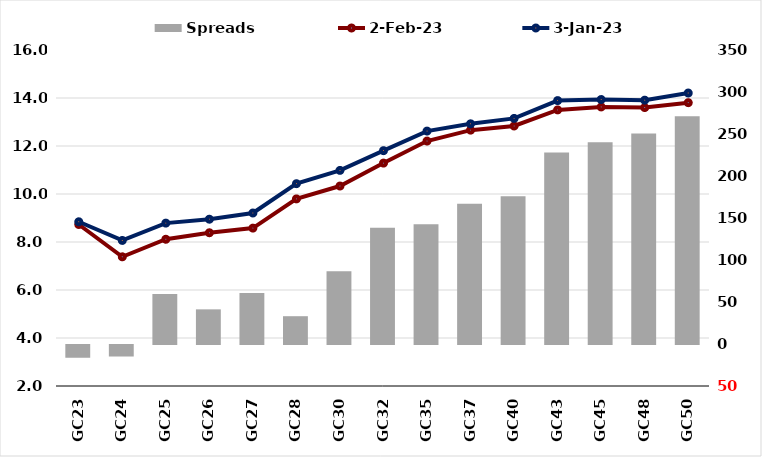
| Category |  Spreads   |
|---|---|
| GC23 | -15.179 |
| GC24 | -13.707 |
| GC25 | 59.393 |
| GC26 | 41.246 |
| GC27 | 60.611 |
| GC28 | 33.099 |
| GC30 | 86.689 |
| GC32 | 138.274 |
| GC35 | 142.598 |
| GC37 | 167.068 |
| GC40 | 175.876 |
| GC43 | 227.913 |
| GC45 | 240.219 |
| GC48 | 250.641 |
| GC50 | 271.032 |